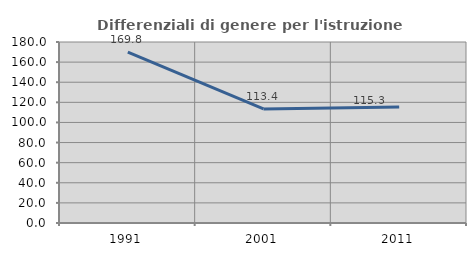
| Category | Differenziali di genere per l'istruzione superiore |
|---|---|
| 1991.0 | 169.848 |
| 2001.0 | 113.413 |
| 2011.0 | 115.285 |